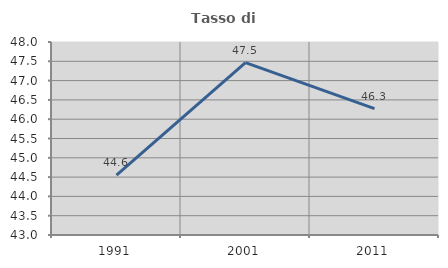
| Category | Tasso di occupazione   |
|---|---|
| 1991.0 | 44.554 |
| 2001.0 | 47.464 |
| 2011.0 | 46.273 |